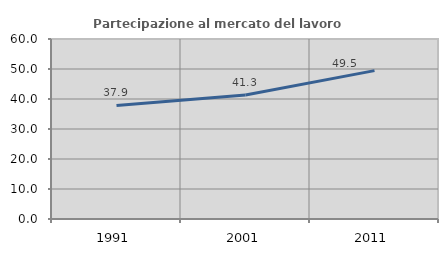
| Category | Partecipazione al mercato del lavoro  femminile |
|---|---|
| 1991.0 | 37.873 |
| 2001.0 | 41.346 |
| 2011.0 | 49.46 |